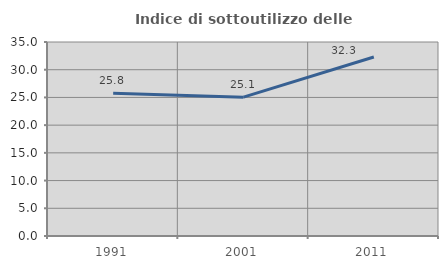
| Category | Indice di sottoutilizzo delle abitazioni  |
|---|---|
| 1991.0 | 25.762 |
| 2001.0 | 25.052 |
| 2011.0 | 32.292 |